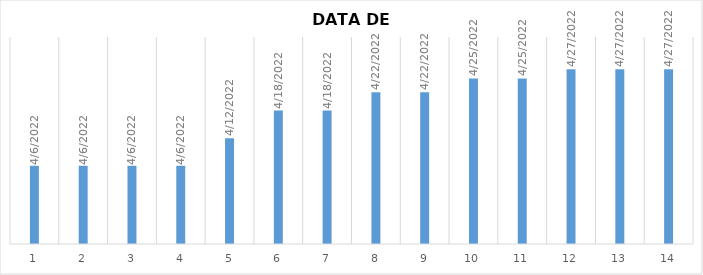
| Category | DATA PAGAMENTO |
|---|---|
| 0 | 4/6/22 |
| 1 | 4/6/22 |
| 2 | 4/6/22 |
| 3 | 4/6/22 |
| 4 | 4/12/22 |
| 5 | 4/18/22 |
| 6 | 4/18/22 |
| 7 | 4/22/22 |
| 8 | 4/22/22 |
| 9 | 4/25/22 |
| 10 | 4/25/22 |
| 11 | 4/27/22 |
| 12 | 4/27/22 |
| 13 | 4/27/22 |